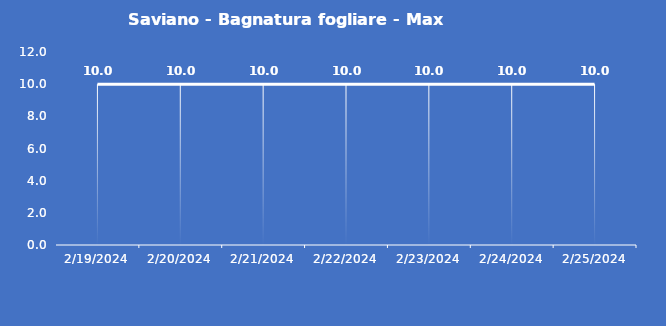
| Category | Saviano - Bagnatura fogliare - Max (min) |
|---|---|
| 2/19/24 | 10 |
| 2/20/24 | 10 |
| 2/21/24 | 10 |
| 2/22/24 | 10 |
| 2/23/24 | 10 |
| 2/24/24 | 10 |
| 2/25/24 | 10 |